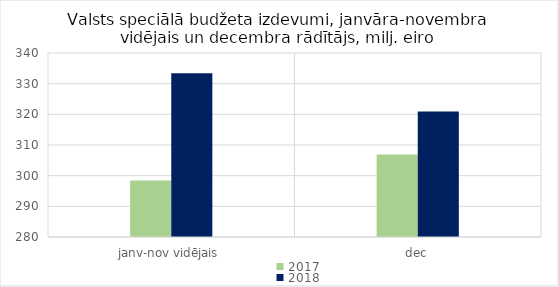
| Category | 2017 | 2018 |
|---|---|---|
| janv-nov vidējais | 298428.976 | 333391.089 |
| dec | 306911.749 | 320964.427 |